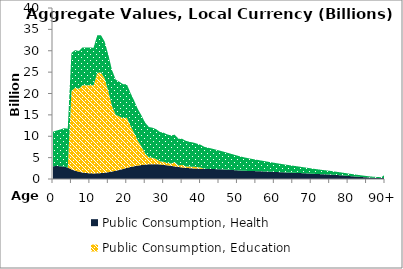
| Category | Public Consumption, Health | Public Consumption, Education | Public Consumption, Other than health and education |
|---|---|---|---|
| 0 | 2989.538 | 0 | 8076.591 |
|  | 3045.862 | 0 | 8295.617 |
| 2 | 2986.964 | 0 | 8597.772 |
| 3 | 2911.847 | 0 | 8972.659 |
| 4 | 2665.38 | 0 | 9103.258 |
| 5 | 2264.519 | 18321.145 | 8928.519 |
| 6 | 1942.491 | 19393.945 | 8818.268 |
| 7 | 1706.278 | 19420.432 | 8819.917 |
| 8 | 1529 | 20431.437 | 8828.475 |
| 9 | 1402.199 | 20511.941 | 8818.626 |
| 10 | 1334.735 | 20595.752 | 8816.332 |
| 11 | 1308.325 | 20595.918 | 8811.059 |
| 12 | 1327.24 | 23517.156 | 8785.427 |
| 13 | 1378.922 | 23543.356 | 8722.115 |
| 14 | 1467.943 | 22049.767 | 8621.306 |
| 15 | 1595.076 | 18932.405 | 8511.974 |
| 16 | 1754.315 | 15318.554 | 8397.804 |
| 17 | 1929.582 | 13057.727 | 8260.609 |
| 18 | 2127.714 | 12511.415 | 8105.971 |
| 19 | 2352.61 | 11850.499 | 7959.031 |
| 20 | 2597.571 | 11771.6 | 7823.955 |
| 21 | 2808.693 | 9657.676 | 7686.877 |
| 22 | 2987.736 | 7788.917 | 7549.543 |
| 23 | 3137.498 | 5811.376 | 7412.293 |
| 24 | 3261.164 | 4307.403 | 7285.509 |
| 25 | 3370.836 | 2601.033 | 7178.519 |
| 26 | 3443.195 | 1626.287 | 7092.829 |
| 27 | 3477.408 | 1491.039 | 7024.235 |
| 28 | 3464.667 | 1207.197 | 6961.361 |
| 29 | 3408.647 | 705.323 | 6888.224 |
| 30 | 3300.628 | 728.187 | 6797.842 |
| 31 | 3188.32 | 539.813 | 6689.235 |
| 32 | 3069.059 | 568.605 | 6560.958 |
| 33 | 2943.778 | 1002.561 | 6413.265 |
| 34 | 2819.193 | 345.068 | 6257.36 |
| 35 | 2702.779 | 584.765 | 6113.26 |
| 36 | 2611.489 | 346.66 | 5969.347 |
| 37 | 2535.077 | 362.519 | 5813.191 |
| 38 | 2478.936 | 400.887 | 5652.678 |
| 39 | 2438.653 | 356.274 | 5485.483 |
| 40 | 2412.605 | 289.129 | 5312.767 |
| 41 | 2389.418 | 0 | 5141.258 |
| 42 | 2365.672 | 0 | 4964.477 |
| 43 | 2338.997 | 0 | 4781.904 |
| 44 | 2311.583 | 0 | 4595.731 |
| 45 | 2281.1 | 0 | 4405.297 |
| 46 | 2241.126 | 0 | 4211.692 |
| 47 | 2192.767 | 0 | 4016.781 |
| 48 | 2138.879 | 0 | 3824.387 |
| 49 | 2080.763 | 0 | 3636.474 |
| 50 | 2016.755 | 0 | 3449.859 |
| 51 | 1960.266 | 0 | 3272.794 |
| 52 | 1918.722 | 0 | 3111.784 |
| 53 | 1883.773 | 0 | 2965.091 |
| 54 | 1859.85 | 0 | 2829.633 |
| 55 | 1838.81 | 0 | 2699.098 |
| 56 | 1812.051 | 0 | 2574.07 |
| 57 | 1779.41 | 0 | 2454.563 |
| 58 | 1741.063 | 0 | 2340.583 |
| 59 | 1701.016 | 0 | 2232.008 |
| 60 | 1656.438 | 0 | 2128.217 |
| 61 | 1614.363 | 0 | 2028.308 |
| 62 | 1576.178 | 0 | 1931.271 |
| 63 | 1536.914 | 0 | 1836.245 |
| 64 | 1501.281 | 0 | 1743.118 |
| 65 | 1467.273 | 0 | 1652.31 |
| 66 | 1430.904 | 0 | 1563.851 |
| 67 | 1390.404 | 0 | 1477.38 |
| 68 | 1346.849 | 0 | 1392.828 |
| 69 | 1299.75 | 0 | 1310.551 |
| 70 | 1247.661 | 0 | 1230.754 |
| 71 | 1198.587 | 0 | 1153.395 |
| 72 | 1155.04 | 0 | 1078.406 |
| 73 | 1114.604 | 0 | 1005.782 |
| 74 | 1080.949 | 0 | 935.349 |
| 75 | 1048.481 | 0 | 866.895 |
| 76 | 999.359 | 0 | 800.473 |
| 77 | 939.664 | 0 | 736.503 |
| 78 | 871.11 | 0 | 675.362 |
| 79 | 798.19 | 0 | 618.123 |
| 80 | 720.491 | 0 | 564.803 |
| 81 | 649.459 | 0 | 514.148 |
| 82 | 579.979 | 0 | 462.513 |
| 83 | 511.045 | 0 | 409.97 |
| 84 | 448.359 | 0 | 360.422 |
| 85 | 386.643 | 0 | 310.81 |
| 86 | 331.263 | 0 | 266.292 |
| 87 | 289.299 | 0 | 232.559 |
| 88 | 257.032 | 0 | 206.62 |
| 89 | 229.02 | 0 | 184.102 |
| 90+ | 199.992 | 0 | 815.463 |